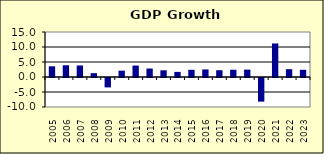
| Category | 2.3 |
|---|---|
| 2005.0 | 3.563 |
| 2006.0 | 3.912 |
| 2007.0 | 3.84 |
| 2008.0 | 1.274 |
| 2009.0 | -3.133 |
| 2010.0 | 2.106 |
| 2011.0 | 3.812 |
| 2012.0 | 2.814 |
| 2013.0 | 2.239 |
| 2014.0 | 1.704 |
| 2015.0 | 2.4 |
| 2016.0 | 2.515 |
| 2017.0 | 2.262 |
| 2018.0 | 2.422 |
| 2019.0 | 2.456 |
| 2020.0 | -7.878 |
| 2021.0 | 11.178 |
| 2022.0 | 2.6 |
| 2023.0 | 2.4 |